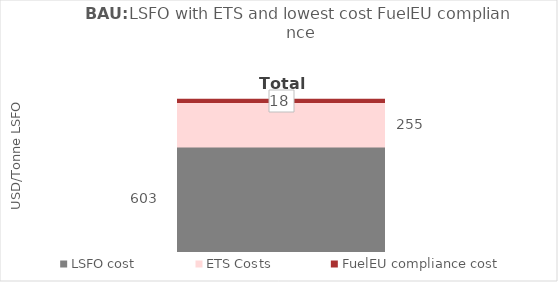
| Category | LSFO cost | ETS Costs | FuelEU compliance cost |
|---|---|---|---|
| 2025.0 | 602.52 | 255.109 | 18.4 |